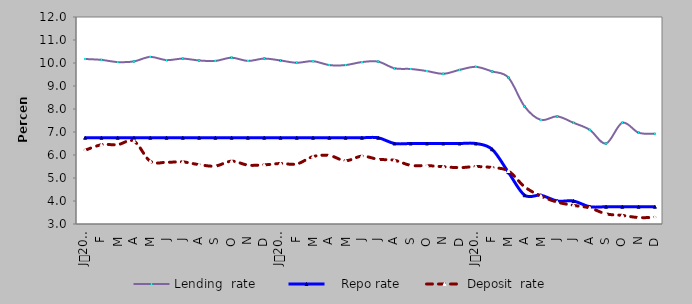
| Category | Lending  rate |    Repo rate | Deposit  rate |
|---|---|---|---|
| 0 | 10.174 | 6.75 | 6.207 |
| 1900-01-01 | 10.136 | 6.75 | 6.446 |
| 1900-01-02 | 10.04 | 6.75 | 6.45 |
| 1900-01-03 | 10.07 | 6.75 | 6.6 |
| 1900-01-04 | 10.265 | 6.75 | 5.728 |
| 1900-01-05 | 10.125 | 6.75 | 5.682 |
| 1900-01-06 | 10.19 | 6.75 | 5.7 |
| 1900-01-07 | 10.11 | 6.75 | 5.58 |
| 1900-01-08 | 10.09 | 6.75 | 5.52 |
| 1900-01-09 | 10.23 | 6.75 | 5.73 |
| 1900-01-10 | 10.09 | 6.75 | 5.56 |
| 1900-01-11 | 10.192 | 6.75 | 5.572 |
| 1900-01-12 | 10.11 | 6.75 | 5.63 |
| 1900-01-13 | 10.01 | 6.75 | 5.61 |
| 1900-01-14 | 10.08 | 6.75 | 5.93 |
| 1900-01-15 | 9.91 | 6.75 | 5.98 |
| 1900-01-16 | 9.91 | 6.75 | 5.75 |
| 1900-01-17 | 10.04 | 6.75 | 5.95 |
| 1900-01-18 | 10.06 | 6.75 | 5.813 |
| 1900-01-19 | 9.77 | 6.5 | 5.77 |
| 1900-01-20 | 9.74 | 6.5 | 5.55 |
| 1900-01-21 | 9.65 | 6.5 | 5.54 |
| 1900-01-22 | 9.53 | 6.5 | 5.49 |
| 1900-01-23 | 9.7 | 6.5 | 5.45 |
| 1900-01-24 | 9.833 | 6.5 | 5.497 |
| 1900-01-25 | 9.634 | 6.25 | 5.454 |
| 1900-01-26 | 9.369 | 5.25 | 5.304 |
| 1900-01-27 | 8.106 | 4.25 | 4.617 |
| 1900-01-28 | 7.526 | 4.25 | 4.216 |
| 1900-01-29 | 7.679 | 4 | 3.952 |
| 1900-01-30 | 7.4 | 4 | 3.81 |
| 1900-01-31 | 7.095 | 3.75 | 3.699 |
| 1900-02-01 | 6.5 | 3.75 | 3.44 |
| 1900-02-02 | 7.402 | 3.75 | 3.374 |
| 1900-02-03 | 6.97 | 3.75 | 3.28 |
| 1900-02-04 | 6.92 | 3.75 | 3.29 |